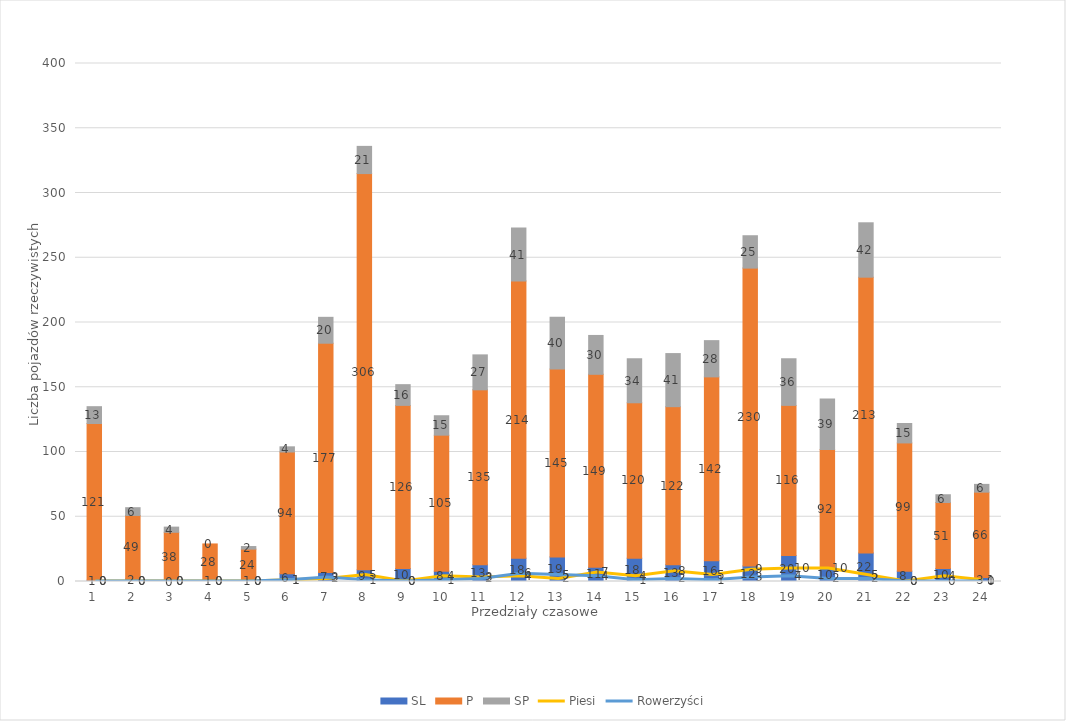
| Category | SL | P | SP |
|---|---|---|---|
| 0 | 1 | 121 | 13 |
| 1 | 2 | 49 | 6 |
| 2 | 0 | 38 | 4 |
| 3 | 1 | 28 | 0 |
| 4 | 1 | 24 | 2 |
| 5 | 6 | 94 | 4 |
| 6 | 7 | 177 | 20 |
| 7 | 9 | 306 | 21 |
| 8 | 10 | 126 | 16 |
| 9 | 8 | 105 | 15 |
| 10 | 13 | 135 | 27 |
| 11 | 18 | 214 | 41 |
| 12 | 19 | 145 | 40 |
| 13 | 11 | 149 | 30 |
| 14 | 18 | 120 | 34 |
| 15 | 13 | 122 | 41 |
| 16 | 16 | 142 | 28 |
| 17 | 12 | 230 | 25 |
| 18 | 20 | 116 | 36 |
| 19 | 10 | 92 | 39 |
| 20 | 22 | 213 | 42 |
| 21 | 8 | 99 | 15 |
| 22 | 10 | 51 | 6 |
| 23 | 3 | 66 | 6 |